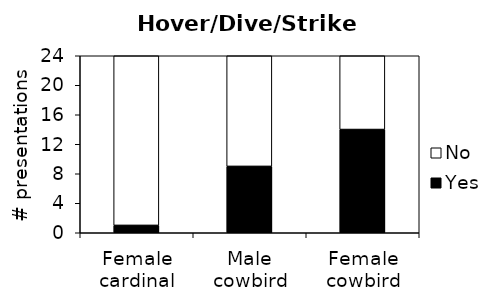
| Category | Yes | No |
|---|---|---|
| Female cardinal | 1 | 23 |
| Male cowbird | 9 | 15 |
| Female cowbird | 14 | 10 |